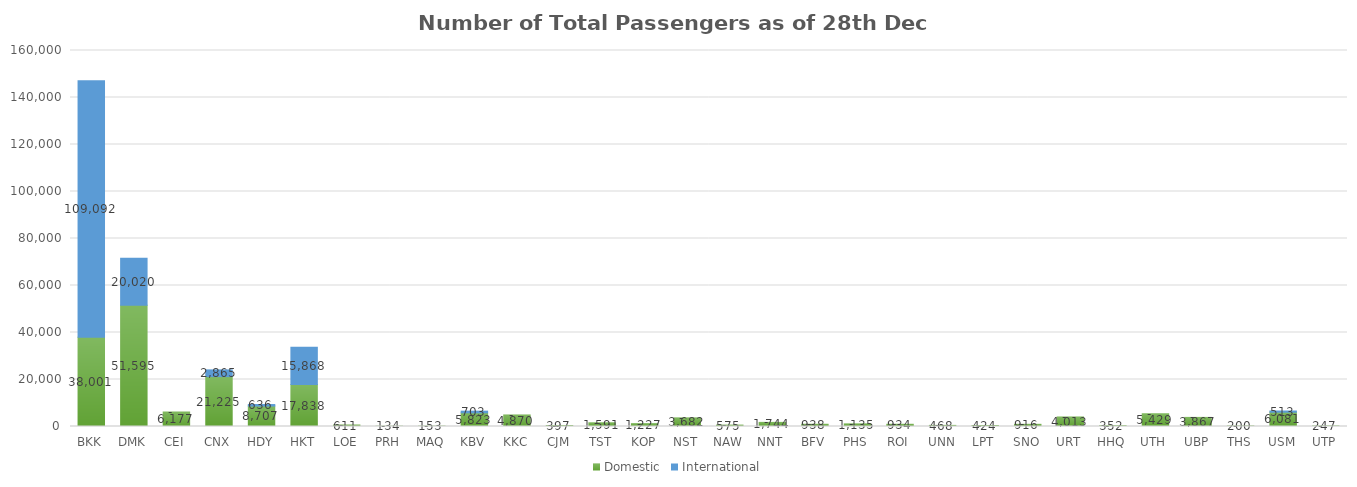
| Category | Domestic | International |
|---|---|---|
| BKK | 38001 | 109092 |
| DMK | 51595 | 20020 |
| CEI | 6177 | 0 |
| CNX | 21225 | 2865 |
| HDY | 8707 | 636 |
| HKT | 17838 | 15868 |
| LOE | 611 | 0 |
| PRH | 134 | 0 |
| MAQ | 153 | 0 |
| KBV | 5823 | 703 |
| KKC | 4870 | 0 |
| CJM | 397 | 0 |
| TST | 1591 | 0 |
| KOP | 1227 | 0 |
| NST | 3682 | 0 |
| NAW | 575 | 0 |
| NNT | 1744 | 0 |
| BFV | 938 | 0 |
| PHS | 1135 | 0 |
| ROI | 934 | 0 |
| UNN | 468 | 0 |
| LPT | 424 | 0 |
| SNO | 916 | 0 |
| URT | 4013 | 0 |
| HHQ | 352 | 0 |
| UTH | 5429 | 0 |
| UBP | 3867 | 0 |
| THS | 200 | 0 |
| USM | 6081 | 513 |
| UTP | 247 | 0 |